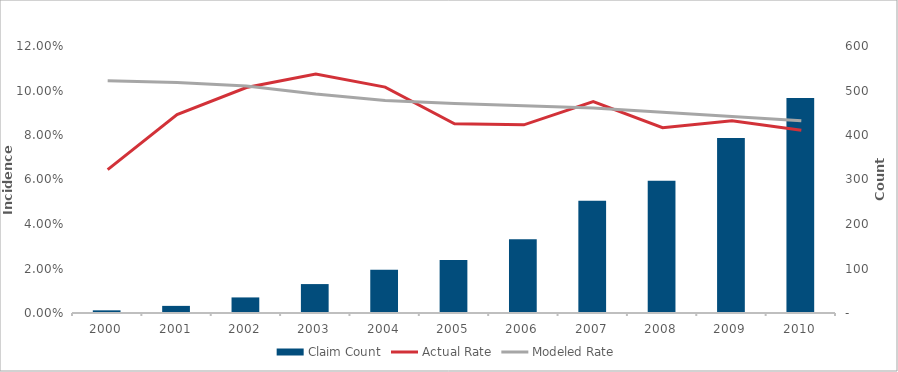
| Category | Claim Count |
|---|---|
| 2000.0 | 6 |
| 2001.0 | 16 |
| 2002.0 | 35 |
| 2003.0 | 65 |
| 2004.0 | 97 |
| 2005.0 | 119 |
| 2006.0 | 166 |
| 2007.0 | 252 |
| 2008.0 | 297 |
| 2009.0 | 393 |
| 2010.0 | 483 |